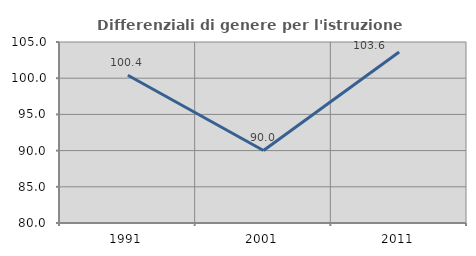
| Category | Differenziali di genere per l'istruzione superiore |
|---|---|
| 1991.0 | 100.406 |
| 2001.0 | 90.017 |
| 2011.0 | 103.613 |